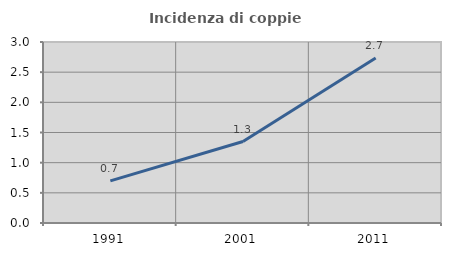
| Category | Incidenza di coppie miste |
|---|---|
| 1991.0 | 0.699 |
| 2001.0 | 1.35 |
| 2011.0 | 2.735 |